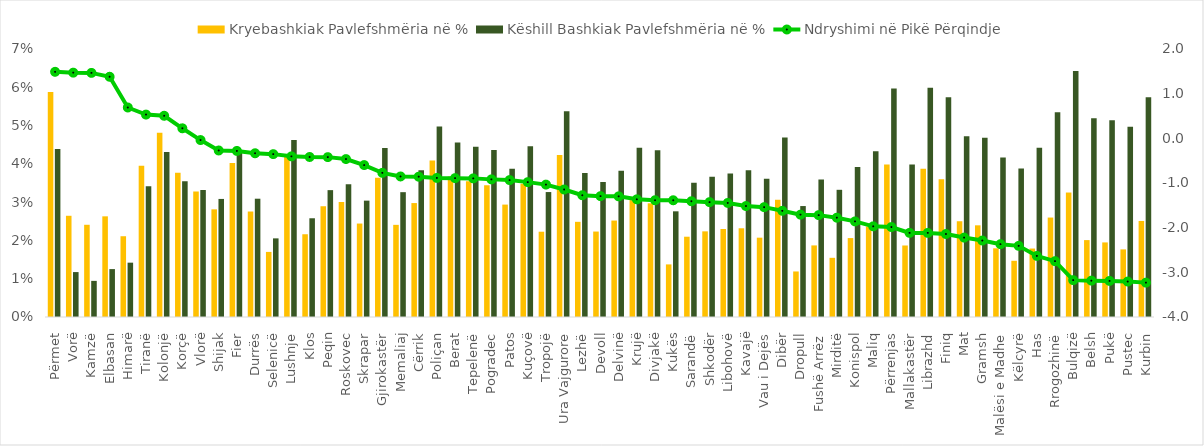
| Category | Kryebashkiak Pavlefshmëria në % | Këshill Bashkiak Pavlefshmëria në % |
|---|---|---|
| Përmet | 0.059 | 0.044 |
| Vorë | 0.026 | 0.012 |
| Kamzë | 0.024 | 0.009 |
| Elbasan | 0.026 | 0.013 |
| Himarë | 0.021 | 0.014 |
| Tiranë | 0.039 | 0.034 |
| Kolonjë | 0.048 | 0.043 |
| Korçë | 0.038 | 0.035 |
| Vlorë | 0.033 | 0.033 |
| Shijak | 0.028 | 0.031 |
| Fier | 0.04 | 0.043 |
| Durrës | 0.028 | 0.031 |
| Selenicë | 0.017 | 0.021 |
| Lushnje | 0.042 | 0.046 |
| Klos | 0.022 | 0.026 |
| Peqin | 0.029 | 0.033 |
| Roskovec | 0.03 | 0.035 |
| Skrapar | 0.024 | 0.03 |
| Gjirokastër | 0.036 | 0.044 |
| Memaliaj | 0.024 | 0.033 |
| Cërrik | 0.03 | 0.038 |
| Poliçan | 0.041 | 0.05 |
| Berat | 0.037 | 0.046 |
| Tepelenë | 0.035 | 0.044 |
| Pogradec | 0.034 | 0.044 |
| Patos | 0.029 | 0.039 |
| Kuçovë | 0.035 | 0.045 |
| Tropojë | 0.022 | 0.033 |
| Ura Vajgurore | 0.042 | 0.054 |
| Lezhë | 0.025 | 0.038 |
| Devoll | 0.022 | 0.035 |
| Delvinë | 0.025 | 0.038 |
| Krujë | 0.031 | 0.044 |
| Divjakë | 0.03 | 0.044 |
| Kukës | 0.014 | 0.028 |
| Sarandë | 0.021 | 0.035 |
| Shkodër | 0.022 | 0.037 |
| Libohovë | 0.023 | 0.037 |
| Kavajë | 0.023 | 0.038 |
| Vau i Dejës | 0.021 | 0.036 |
| Dibër | 0.031 | 0.047 |
| Dropull | 0.012 | 0.029 |
| Fushë Arrëz | 0.019 | 0.036 |
| Mirditë | 0.015 | 0.033 |
| Konispol | 0.021 | 0.039 |
| Maliq | 0.024 | 0.043 |
| Përrenjas | 0.04 | 0.06 |
| Mallakastër | 0.019 | 0.04 |
| Librazhd | 0.039 | 0.06 |
| Finiq | 0.036 | 0.057 |
| Mat | 0.025 | 0.047 |
| Gramsh | 0.024 | 0.047 |
| Malësi e Madhe | 0.018 | 0.042 |
| Këlcyrë | 0.015 | 0.039 |
| Has | 0.018 | 0.044 |
| Rrogozhinë | 0.026 | 0.053 |
| Bulqizë | 0.033 | 0.064 |
| Belsh | 0.02 | 0.052 |
| Pukë | 0.019 | 0.051 |
| Pustec | 0.018 | 0.05 |
| Kurbin | 0.025 | 0.057 |